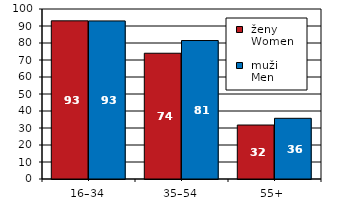
| Category |  ženy 
 Women |  muži 
 Men |
|---|---|---|
| 16–34 | 93.037 | 92.985 |
| 35–54 | 73.974 | 81.456 |
| 55+  | 31.754 | 35.699 |